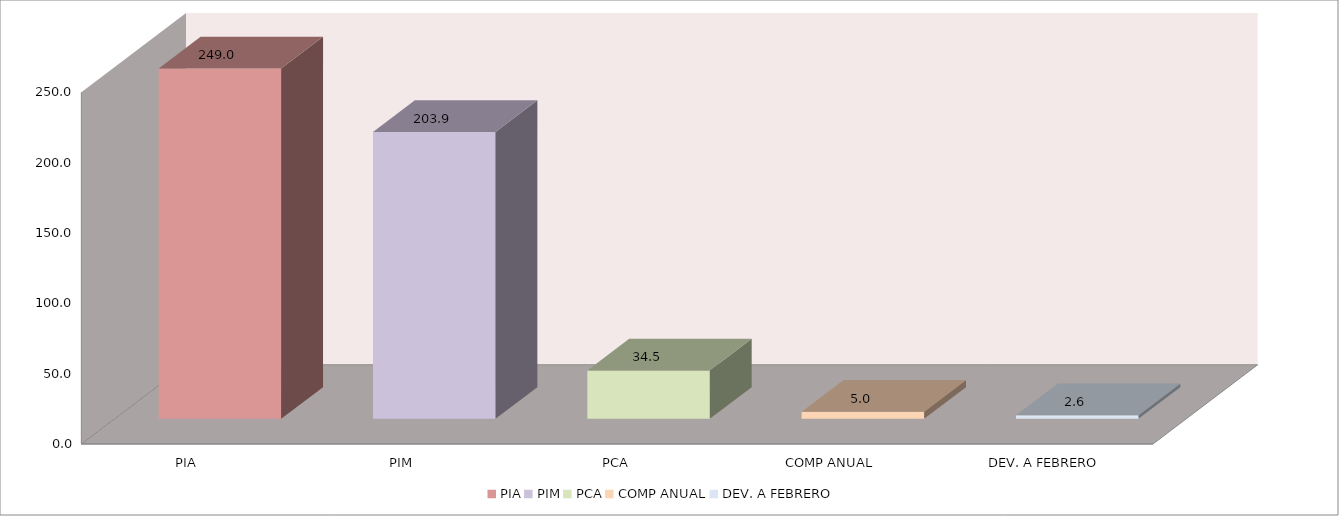
| Category | 011 MINISTERIO DE SALUD |
|---|---|
| PIA | 249.028 |
| PIM | 203.887 |
| PCA | 34.45 |
| COMP ANUAL | 5.017 |
| DEV. A FEBRERO | 2.594 |